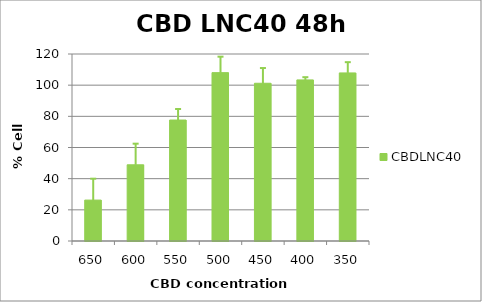
| Category | CBDLNC40 |
|---|---|
| 650.0 | 26.253 |
| 600.0 | 48.898 |
| 550.0 | 77.618 |
| 500.0 | 108.039 |
| 450.0 | 101.224 |
| 400.0 | 103.384 |
| 350.0 | 107.865 |